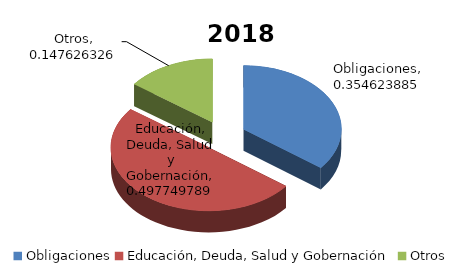
| Category | 2018 |
|---|---|
| Obligaciones | 0.355 |
| Educación, Deuda, Salud y Gobernación | 0.498 |
| Otros | 0.148 |